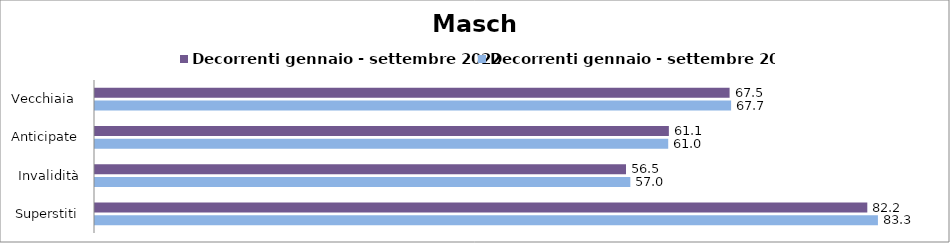
| Category | Decorrenti gennaio - settembre 2022 | Decorrenti gennaio - settembre 2023 |
|---|---|---|
| Vecchiaia  | 67.51 | 67.67 |
| Anticipate | 61.05 | 60.98 |
| Invalidità | 56.49 | 56.95 |
| Superstiti | 82.16 | 83.29 |